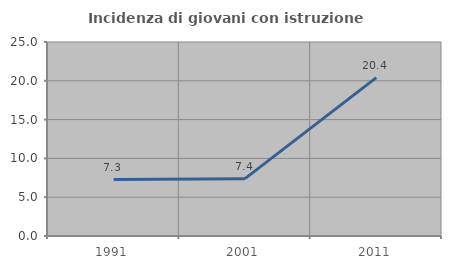
| Category | Incidenza di giovani con istruzione universitaria |
|---|---|
| 1991.0 | 7.266 |
| 2001.0 | 7.39 |
| 2011.0 | 20.408 |